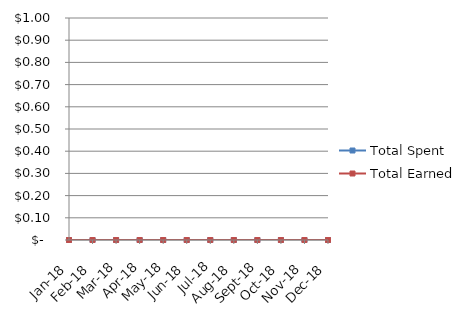
| Category | Total Spent | Total Earned |
|---|---|---|
| 2018-01-01 | 0 | 0 |
| 2018-02-01 | 0 | 0 |
| 2018-03-01 | 0 | 0 |
| 2018-04-01 | 0 | 0 |
| 2018-05-01 | 0 | 0 |
| 2018-06-01 | 0 | 0 |
| 2018-07-01 | 0 | 0 |
| 2018-08-01 | 0 | 0 |
| 2018-09-01 | 0 | 0 |
| 2018-10-01 | 0 | 0 |
| 2018-11-01 | 0 | 0 |
| 2018-12-01 | 0 | 0 |